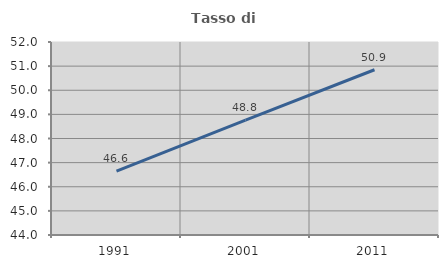
| Category | Tasso di occupazione   |
|---|---|
| 1991.0 | 46.644 |
| 2001.0 | 48.761 |
| 2011.0 | 50.85 |